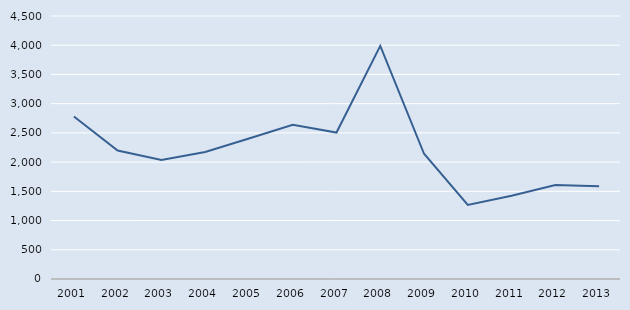
| Category | Series 0 |
|---|---|
| 2001.0 | 2780 |
| 2002.0 | 2198 |
| 2003.0 | 2037 |
| 2004.0 | 2173 |
| 2005.0 | 2403 |
| 2006.0 | 2638 |
| 2007.0 | 2506 |
| 2008.0 | 3988 |
| 2009.0 | 2143 |
| 2010.0 | 1266 |
| 2011.0 | 1426 |
| 2012.0 | 1607 |
| 2013.0 | 1585 |